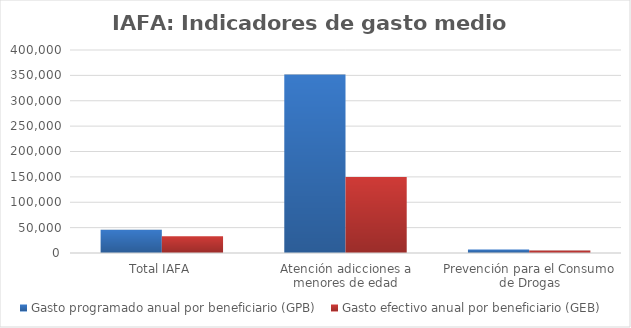
| Category | Gasto programado anual por beneficiario (GPB)  | Gasto efectivo anual por beneficiario (GEB)  |
|---|---|---|
| Total IAFA | 45786.778 | 33161.997 |
| Atención adicciones a menores de edad | 351650 | 149904.156 |
| Prevención para el Consumo de Drogas | 7038.123 | 4850.991 |